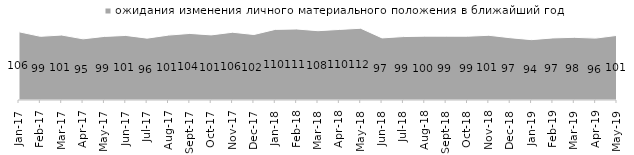
| Category | ожидания изменения личного материального положения в ближайший год |
|---|---|
| 2017-01-01 | 106.3 |
| 2017-02-01 | 99.25 |
| 2017-03-01 | 101.25 |
| 2017-04-01 | 95.3 |
| 2017-05-01 | 99.1 |
| 2017-06-01 | 100.6 |
| 2017-07-01 | 96.4 |
| 2017-08-01 | 101.15 |
| 2017-09-01 | 103.75 |
| 2017-10-01 | 101.45 |
| 2017-11-01 | 105.6 |
| 2017-12-01 | 102.05 |
| 2018-01-01 | 110.05 |
| 2018-02-01 | 110.65 |
| 2018-03-01 | 108 |
| 2018-04-01 | 109.95 |
| 2018-05-01 | 111.8 |
| 2018-06-01 | 96.75 |
| 2018-07-01 | 98.85 |
| 2018-08-01 | 99.5 |
| 2018-09-01 | 99.45 |
| 2018-10-01 | 99.4 |
| 2018-11-01 | 100.848 |
| 2018-12-01 | 97.05 |
| 2019-01-01 | 94.05 |
| 2019-02-01 | 96.75 |
| 2019-03-01 | 97.663 |
| 2019-04-01 | 96.436 |
| 2019-05-01 | 100.693 |